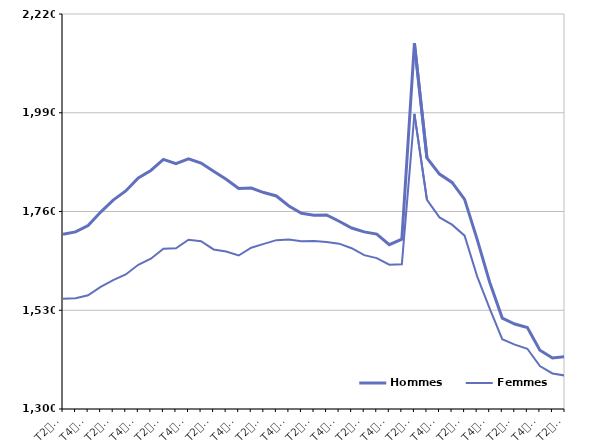
| Category | Hommes  | Femmes  |
|---|---|---|
| T2
2013 | 1707.1 | 1556.8 |
| T3
2013 | 1712.4 | 1557.9 |
| T4
2013 | 1727.4 | 1564.9 |
| T1
2014 | 1758.7 | 1584.6 |
| T2
2014 | 1786.4 | 1600.2 |
| T3
2014 | 1807.9 | 1613.4 |
| T4
2014 | 1837.9 | 1636 |
| T1
2015 | 1855.6 | 1650 |
| T2
2015 | 1881.3 | 1673.4 |
| T3
2015 | 1871.3 | 1674.2 |
| T4
2015 | 1882.7 | 1694.1 |
| T1
2016 | 1872.7 | 1690.8 |
| T2
2016 | 1853.5 | 1671.6 |
| T3
2016 | 1835.3 | 1667 |
| T4
2016 | 1813.8 | 1657.5 |
| T1
2017 | 1814.6 | 1675.6 |
| T2
2017 | 1804.1 | 1684.5 |
| T3
2017 | 1796.2 | 1693.3 |
| T4
2017 | 1772.8 | 1694.5 |
| T1
2018 | 1755.9 | 1690.9 |
| T2
2018 | 1751.1 | 1691.5 |
| T3
2018 | 1752 | 1688.8 |
| T4
2018 | 1737.3 | 1685.1 |
| T1
2019 | 1721.5 | 1674.5 |
| T2
2019 | 1712.6 | 1658.4 |
| T3
2019 | 1707.3 | 1651.4 |
| T4
2019 | 1682.6 | 1636.1 |
| T1
2020 | 1695.4 | 1637.2 |
| T2
2020 | 2151.8 | 1987.2 |
| T3
2020 | 1884.9 | 1787.3 |
| T4
2020 | 1847.2 | 1746.2 |
| T1
2021 | 1827.6 | 1729.4 |
| T2
2021 | 1788.2 | 1703.7 |
| T3
2021 | 1695 | 1608.9 |
| T4
2021 | 1595.2 | 1533.6 |
| T1
2022 | 1511.8 | 1462.6 |
| T2
2022 | 1498 | 1449.8 |
| T3
2022 | 1489.5 | 1440.3 |
| T4
2022 | 1436.9 | 1400 |
| T1
2023 | 1418.7 | 1382.8 |
| T2
2023 | 1421.7 | 1377.9 |